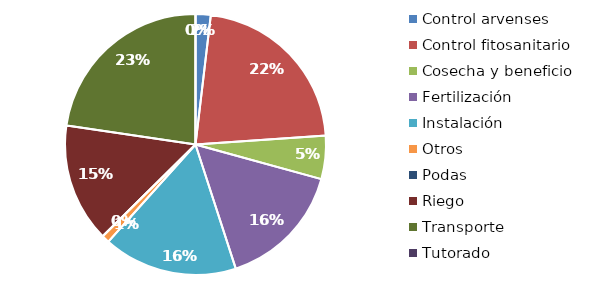
| Category | Valor |
|---|---|
| Control arvenses | 1962000 |
| Control fitosanitario | 23040172 |
| Cosecha y beneficio | 5610806.247 |
| Fertilización | 16445912 |
| Instalación | 17383951.117 |
| Otros | 1009950 |
| Podas | 0 |
| Riego | 15400541 |
| Transporte | 23713115 |
| Tutorado | 0 |